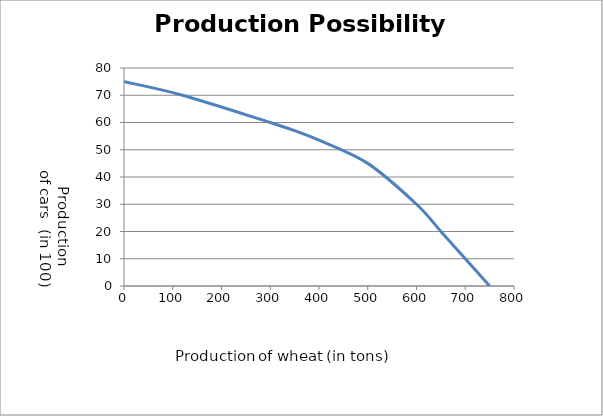
| Category | annual Car production (in 100)  |
|---|---|
| 750.0 | 0 |
| 700.0 | 10 |
| 650.0 | 20 |
| 600.0 | 30 |
| 500.0 | 45 |
| 400.0 | 53.5 |
| 350.0 | 57 |
| 300.0 | 60 |
| 120.0 | 70 |
| 0.0 | 75 |